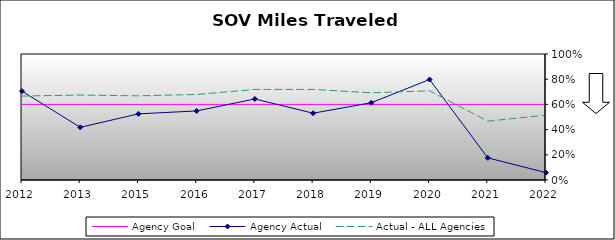
| Category | Agency Goal | Agency Actual | Actual - ALL Agencies |
|---|---|---|---|
| 2012.0 | 0.6 | 0.705 | 0.666 |
| 2013.0 | 0.6 | 0.418 | 0.674 |
| 2015.0 | 0.6 | 0.525 | 0.668 |
| 2016.0 | 0.6 | 0.548 | 0.679 |
| 2017.0 | 0.6 | 0.643 | 0.719 |
| 2018.0 | 0.6 | 0.53 | 0.719 |
| 2019.0 | 0.6 | 0.613 | 0.692 |
| 2020.0 | 0.6 | 0.798 | 0.708 |
| 2021.0 | 0.6 | 0.176 | 0.467 |
| 2022.0 | 0.6 | 0.058 | 0.515 |